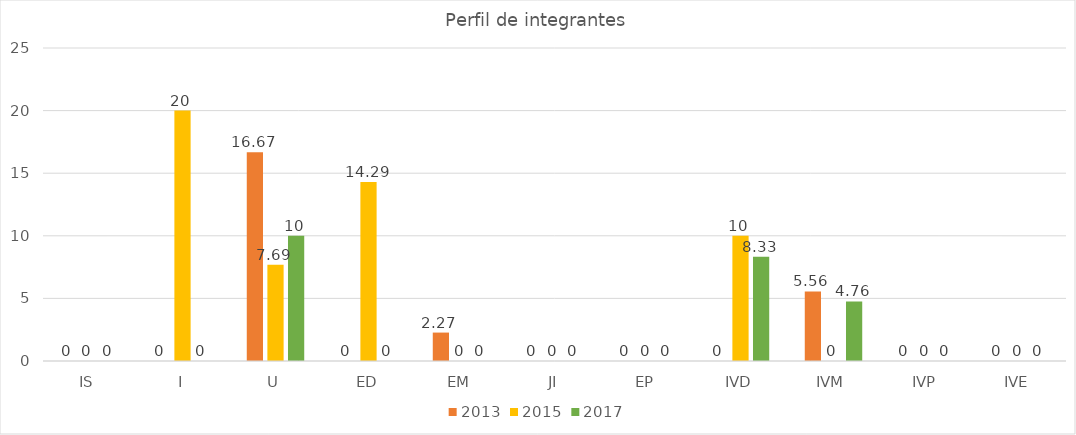
| Category | 2013 | 2015 | 2017 |
|---|---|---|---|
| IS | 0 | 0 | 0 |
| I | 0 | 20 | 0 |
| U | 16.67 | 7.69 | 10 |
| ED | 0 | 14.29 | 0 |
| EM | 2.27 | 0 | 0 |
| JI | 0 | 0 | 0 |
| EP | 0 | 0 | 0 |
| IVD | 0 | 10 | 8.33 |
| IVM | 5.56 | 0 | 4.76 |
| IVP | 0 | 0 | 0 |
| IVE | 0 | 0 | 0 |